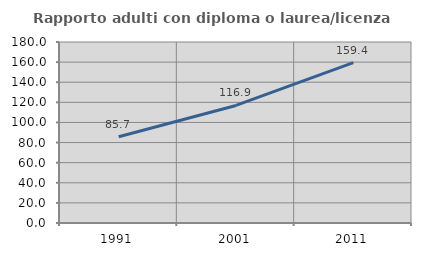
| Category | Rapporto adulti con diploma o laurea/licenza media  |
|---|---|
| 1991.0 | 85.7 |
| 2001.0 | 116.905 |
| 2011.0 | 159.445 |